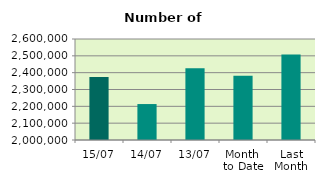
| Category | Series 0 |
|---|---|
| 15/07 | 2374626 |
| 14/07 | 2213580 |
| 13/07 | 2426752 |
| Month 
to Date | 2381802.545 |
| Last
Month | 2507488.545 |